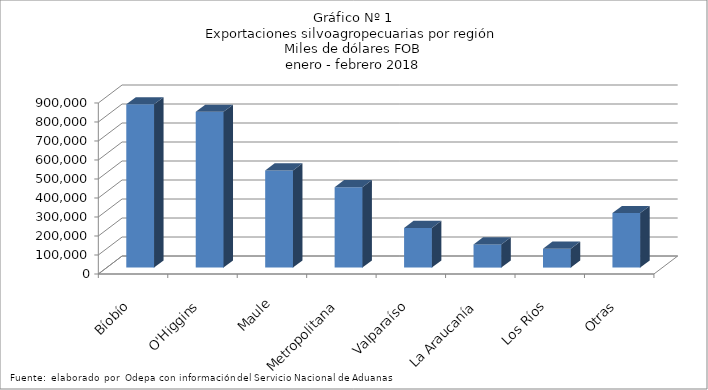
| Category | Series 0 |
|---|---|
| Bíobío | 859081.807 |
| O'Higgins | 819577.876 |
| Maule | 511094.677 |
| Metropolitana | 422859.309 |
| Valparaíso | 208034.915 |
| La Araucanía | 121946.974 |
| Los Ríos | 98945.869 |
| Otras | 286772.381 |